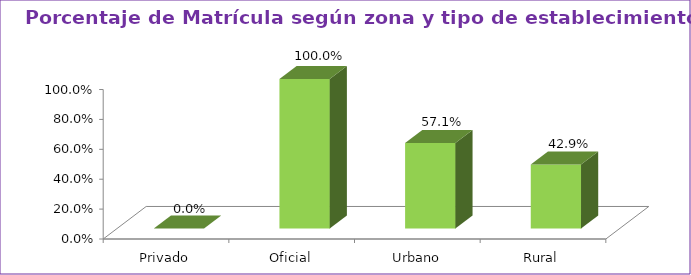
| Category | Series 1 |
|---|---|
| Privado | 0 |
| Oficial | 1 |
| Urbano | 0.571 |
| Rural | 0.429 |